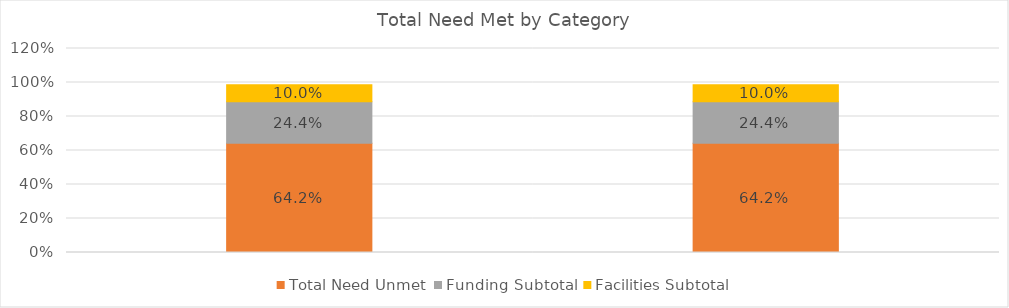
| Category | Total Need Unmet | Funding Subtotal | Facilities Subtotal |
|---|---|---|---|
|  | 0.642 | 0.244 | 0.1 |
|  | 0.642 | 0.244 | 0.1 |